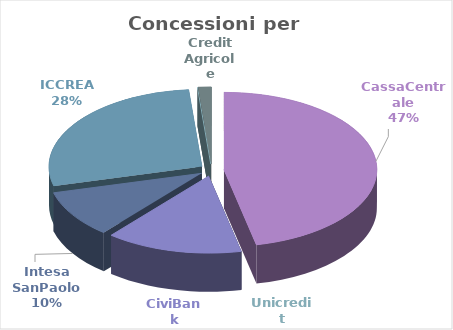
| Category | Series 0 |
|---|---|
| CassaCentrale | 69730900 |
| CiviBank | 21625600 |
| Intesa SanPaolo  | 14810000 |
| ICCREA | 41428744 |
| Unicredit | 0 |
| Credit Agricole | 2076000 |